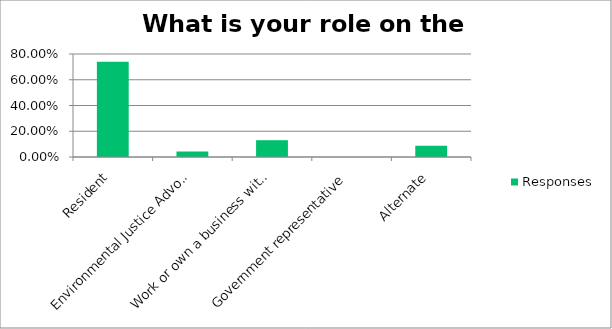
| Category | Responses |
|---|---|
| Resident | 0.739 |
| Environmental Justice Advocate | 0.044 |
| Work or own a business within the boundary | 0.13 |
| Government representative | 0 |
| Alternate | 0.087 |